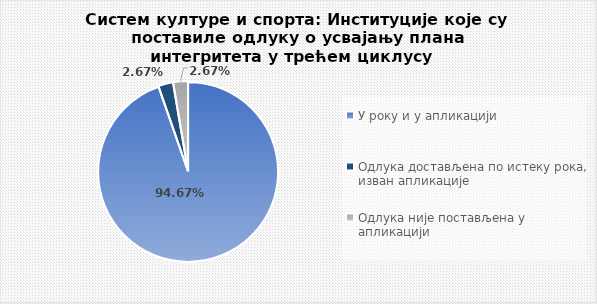
| Category | Series 0 |
|---|---|
| У року и у апликацији | 0.947 |
| Одлука достављена по истеку рока, изван апликације | 0.027 |
| Одлука није постављена у апликацији | 0.027 |